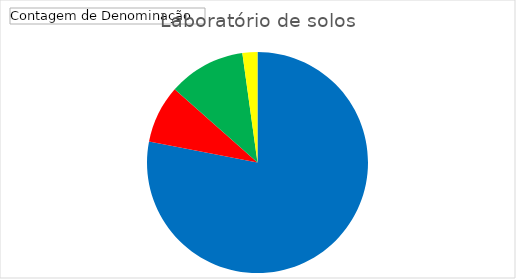
| Category | Total |
|---|---|
| Bem Inventariado | 249 |
| Bem Não Localizado | 27 |
| Bem no setor e fora da carga | 36 |
| Bem Sem Identificação | 7 |